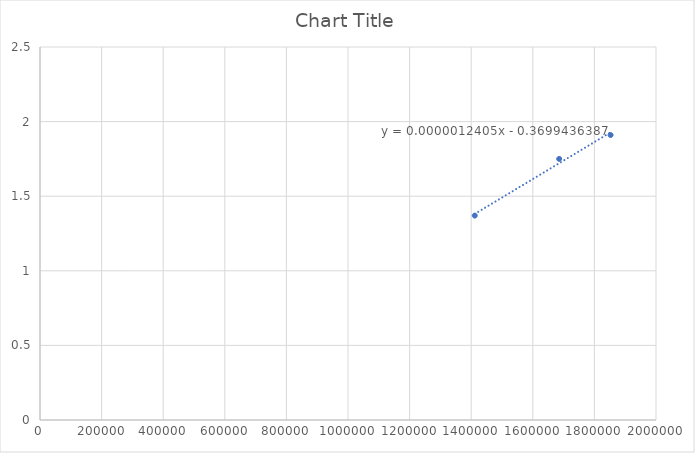
| Category | Series 0 |
|---|---|
| 1411523.9990875116 | 1.37 |
| 1685619.973076595 | 1.75 |
| 1852534.6386208255 | 1.91 |